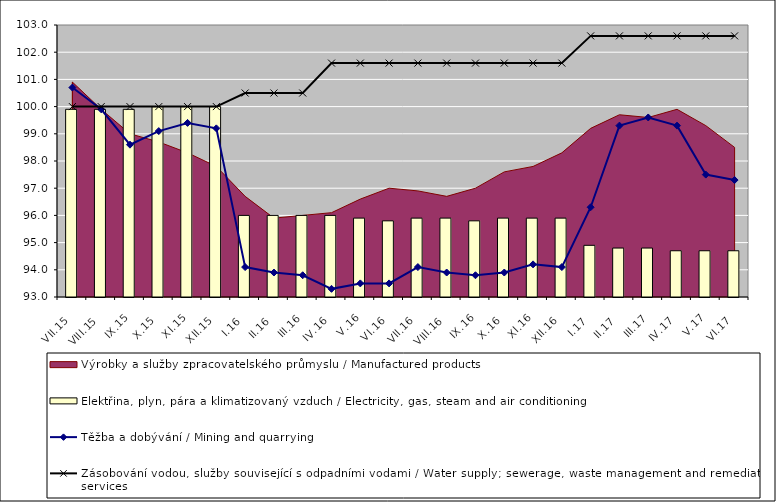
| Category | Elektřina, plyn, pára a klimatizovaný vzduch / Electricity, gas, steam and air conditioning |
|---|---|
| VII.15 | 99.9 |
| VIII.15 | 99.9 |
| IX.15 | 99.9 |
| X.15 | 100 |
| XI.15 | 100 |
| XII.15 | 100 |
| I.16 | 96 |
| II.16 | 96 |
| III.16 | 96 |
| IV.16 | 96 |
| V.16 | 95.9 |
| VI.16 | 95.8 |
| VII.16 | 95.9 |
| VIII.16 | 95.9 |
| IX.16 | 95.8 |
| X.16 | 95.9 |
| XI.16 | 95.9 |
| XII.16 | 95.9 |
| I.17 | 94.9 |
| II.17 | 94.8 |
| III.17 | 94.8 |
| IV.17 | 94.7 |
| V.17 | 94.7 |
| VI.17 | 94.7 |